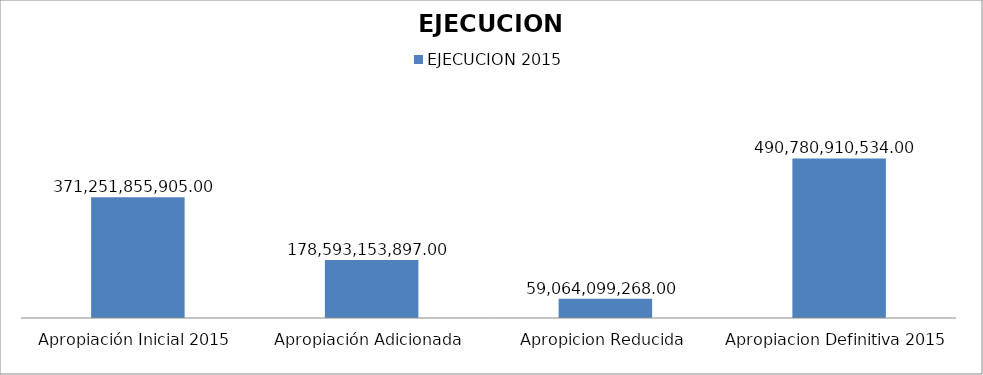
| Category | EJECUCION 2015 |
|---|---|
| Apropiación Inicial 2015 | 371251855905 |
| Apropiación Adicionada | 178593153897 |
| Apropicion Reducida | 59064099268 |
| Apropiacion Definitiva 2015 | 490780910534 |